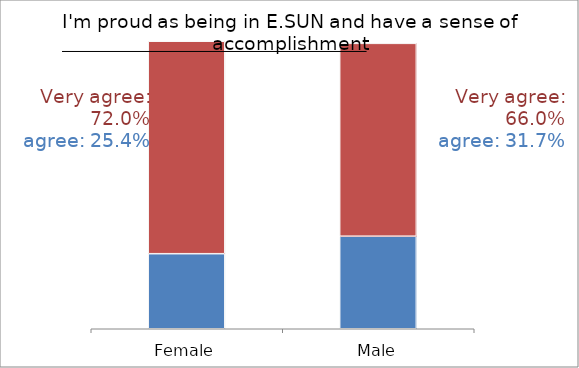
| Category | Agree | Very Agree | Neutral | Very Disagree |
|---|---|---|---|---|
| Female | 750 | 2123 | 44 | 1 |
| Male | 982 | 2046 | 70 | 0 |